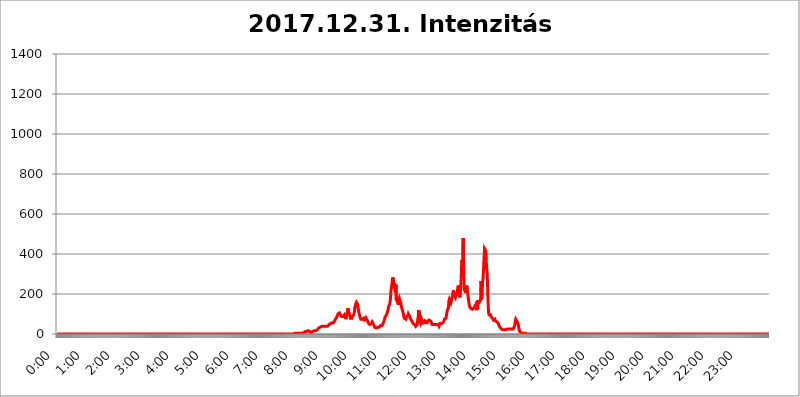
| Category | 2017.12.31. Intenzitás [W/m^2] |
|---|---|
| 0.0 | 0 |
| 0.0006944444444444445 | 0 |
| 0.001388888888888889 | 0 |
| 0.0020833333333333333 | 0 |
| 0.002777777777777778 | 0 |
| 0.003472222222222222 | 0 |
| 0.004166666666666667 | 0 |
| 0.004861111111111111 | 0 |
| 0.005555555555555556 | 0 |
| 0.0062499999999999995 | 0 |
| 0.006944444444444444 | 0 |
| 0.007638888888888889 | 0 |
| 0.008333333333333333 | 0 |
| 0.009027777777777779 | 0 |
| 0.009722222222222222 | 0 |
| 0.010416666666666666 | 0 |
| 0.011111111111111112 | 0 |
| 0.011805555555555555 | 0 |
| 0.012499999999999999 | 0 |
| 0.013194444444444444 | 0 |
| 0.013888888888888888 | 0 |
| 0.014583333333333332 | 0 |
| 0.015277777777777777 | 0 |
| 0.015972222222222224 | 0 |
| 0.016666666666666666 | 0 |
| 0.017361111111111112 | 0 |
| 0.018055555555555557 | 0 |
| 0.01875 | 0 |
| 0.019444444444444445 | 0 |
| 0.02013888888888889 | 0 |
| 0.020833333333333332 | 0 |
| 0.02152777777777778 | 0 |
| 0.022222222222222223 | 0 |
| 0.02291666666666667 | 0 |
| 0.02361111111111111 | 0 |
| 0.024305555555555556 | 0 |
| 0.024999999999999998 | 0 |
| 0.025694444444444447 | 0 |
| 0.02638888888888889 | 0 |
| 0.027083333333333334 | 0 |
| 0.027777777777777776 | 0 |
| 0.02847222222222222 | 0 |
| 0.029166666666666664 | 0 |
| 0.029861111111111113 | 0 |
| 0.030555555555555555 | 0 |
| 0.03125 | 0 |
| 0.03194444444444445 | 0 |
| 0.03263888888888889 | 0 |
| 0.03333333333333333 | 0 |
| 0.034027777777777775 | 0 |
| 0.034722222222222224 | 0 |
| 0.035416666666666666 | 0 |
| 0.036111111111111115 | 0 |
| 0.03680555555555556 | 0 |
| 0.0375 | 0 |
| 0.03819444444444444 | 0 |
| 0.03888888888888889 | 0 |
| 0.03958333333333333 | 0 |
| 0.04027777777777778 | 0 |
| 0.04097222222222222 | 0 |
| 0.041666666666666664 | 0 |
| 0.042361111111111106 | 0 |
| 0.04305555555555556 | 0 |
| 0.043750000000000004 | 0 |
| 0.044444444444444446 | 0 |
| 0.04513888888888889 | 0 |
| 0.04583333333333334 | 0 |
| 0.04652777777777778 | 0 |
| 0.04722222222222222 | 0 |
| 0.04791666666666666 | 0 |
| 0.04861111111111111 | 0 |
| 0.049305555555555554 | 0 |
| 0.049999999999999996 | 0 |
| 0.05069444444444445 | 0 |
| 0.051388888888888894 | 0 |
| 0.052083333333333336 | 0 |
| 0.05277777777777778 | 0 |
| 0.05347222222222222 | 0 |
| 0.05416666666666667 | 0 |
| 0.05486111111111111 | 0 |
| 0.05555555555555555 | 0 |
| 0.05625 | 0 |
| 0.05694444444444444 | 0 |
| 0.057638888888888885 | 0 |
| 0.05833333333333333 | 0 |
| 0.05902777777777778 | 0 |
| 0.059722222222222225 | 0 |
| 0.06041666666666667 | 0 |
| 0.061111111111111116 | 0 |
| 0.06180555555555556 | 0 |
| 0.0625 | 0 |
| 0.06319444444444444 | 0 |
| 0.06388888888888888 | 0 |
| 0.06458333333333334 | 0 |
| 0.06527777777777778 | 0 |
| 0.06597222222222222 | 0 |
| 0.06666666666666667 | 0 |
| 0.06736111111111111 | 0 |
| 0.06805555555555555 | 0 |
| 0.06874999999999999 | 0 |
| 0.06944444444444443 | 0 |
| 0.07013888888888889 | 0 |
| 0.07083333333333333 | 0 |
| 0.07152777777777779 | 0 |
| 0.07222222222222223 | 0 |
| 0.07291666666666667 | 0 |
| 0.07361111111111111 | 0 |
| 0.07430555555555556 | 0 |
| 0.075 | 0 |
| 0.07569444444444444 | 0 |
| 0.0763888888888889 | 0 |
| 0.07708333333333334 | 0 |
| 0.07777777777777778 | 0 |
| 0.07847222222222222 | 0 |
| 0.07916666666666666 | 0 |
| 0.0798611111111111 | 0 |
| 0.08055555555555556 | 0 |
| 0.08125 | 0 |
| 0.08194444444444444 | 0 |
| 0.08263888888888889 | 0 |
| 0.08333333333333333 | 0 |
| 0.08402777777777777 | 0 |
| 0.08472222222222221 | 0 |
| 0.08541666666666665 | 0 |
| 0.08611111111111112 | 0 |
| 0.08680555555555557 | 0 |
| 0.08750000000000001 | 0 |
| 0.08819444444444445 | 0 |
| 0.08888888888888889 | 0 |
| 0.08958333333333333 | 0 |
| 0.09027777777777778 | 0 |
| 0.09097222222222222 | 0 |
| 0.09166666666666667 | 0 |
| 0.09236111111111112 | 0 |
| 0.09305555555555556 | 0 |
| 0.09375 | 0 |
| 0.09444444444444444 | 0 |
| 0.09513888888888888 | 0 |
| 0.09583333333333333 | 0 |
| 0.09652777777777777 | 0 |
| 0.09722222222222222 | 0 |
| 0.09791666666666667 | 0 |
| 0.09861111111111111 | 0 |
| 0.09930555555555555 | 0 |
| 0.09999999999999999 | 0 |
| 0.10069444444444443 | 0 |
| 0.1013888888888889 | 0 |
| 0.10208333333333335 | 0 |
| 0.10277777777777779 | 0 |
| 0.10347222222222223 | 0 |
| 0.10416666666666667 | 0 |
| 0.10486111111111111 | 0 |
| 0.10555555555555556 | 0 |
| 0.10625 | 0 |
| 0.10694444444444444 | 0 |
| 0.1076388888888889 | 0 |
| 0.10833333333333334 | 0 |
| 0.10902777777777778 | 0 |
| 0.10972222222222222 | 0 |
| 0.1111111111111111 | 0 |
| 0.11180555555555556 | 0 |
| 0.11180555555555556 | 0 |
| 0.1125 | 0 |
| 0.11319444444444444 | 0 |
| 0.11388888888888889 | 0 |
| 0.11458333333333333 | 0 |
| 0.11527777777777777 | 0 |
| 0.11597222222222221 | 0 |
| 0.11666666666666665 | 0 |
| 0.1173611111111111 | 0 |
| 0.11805555555555557 | 0 |
| 0.11944444444444445 | 0 |
| 0.12013888888888889 | 0 |
| 0.12083333333333333 | 0 |
| 0.12152777777777778 | 0 |
| 0.12222222222222223 | 0 |
| 0.12291666666666667 | 0 |
| 0.12291666666666667 | 0 |
| 0.12361111111111112 | 0 |
| 0.12430555555555556 | 0 |
| 0.125 | 0 |
| 0.12569444444444444 | 0 |
| 0.12638888888888888 | 0 |
| 0.12708333333333333 | 0 |
| 0.16875 | 0 |
| 0.12847222222222224 | 0 |
| 0.12916666666666668 | 0 |
| 0.12986111111111112 | 0 |
| 0.13055555555555556 | 0 |
| 0.13125 | 0 |
| 0.13194444444444445 | 0 |
| 0.1326388888888889 | 0 |
| 0.13333333333333333 | 0 |
| 0.13402777777777777 | 0 |
| 0.13402777777777777 | 0 |
| 0.13472222222222222 | 0 |
| 0.13541666666666666 | 0 |
| 0.1361111111111111 | 0 |
| 0.13749999999999998 | 0 |
| 0.13819444444444443 | 0 |
| 0.1388888888888889 | 0 |
| 0.13958333333333334 | 0 |
| 0.14027777777777778 | 0 |
| 0.14097222222222222 | 0 |
| 0.14166666666666666 | 0 |
| 0.1423611111111111 | 0 |
| 0.14305555555555557 | 0 |
| 0.14375000000000002 | 0 |
| 0.14444444444444446 | 0 |
| 0.1451388888888889 | 0 |
| 0.1451388888888889 | 0 |
| 0.14652777777777778 | 0 |
| 0.14722222222222223 | 0 |
| 0.14791666666666667 | 0 |
| 0.1486111111111111 | 0 |
| 0.14930555555555555 | 0 |
| 0.15 | 0 |
| 0.15069444444444444 | 0 |
| 0.15138888888888888 | 0 |
| 0.15208333333333332 | 0 |
| 0.15277777777777776 | 0 |
| 0.15347222222222223 | 0 |
| 0.15416666666666667 | 0 |
| 0.15486111111111112 | 0 |
| 0.15555555555555556 | 0 |
| 0.15625 | 0 |
| 0.15694444444444444 | 0 |
| 0.15763888888888888 | 0 |
| 0.15833333333333333 | 0 |
| 0.15902777777777777 | 0 |
| 0.15972222222222224 | 0 |
| 0.16041666666666668 | 0 |
| 0.16111111111111112 | 0 |
| 0.16180555555555556 | 0 |
| 0.1625 | 0 |
| 0.16319444444444445 | 0 |
| 0.1638888888888889 | 0 |
| 0.16458333333333333 | 0 |
| 0.16527777777777777 | 0 |
| 0.16597222222222222 | 0 |
| 0.16666666666666666 | 0 |
| 0.1673611111111111 | 0 |
| 0.16805555555555554 | 0 |
| 0.16874999999999998 | 0 |
| 0.16944444444444443 | 0 |
| 0.17013888888888887 | 0 |
| 0.1708333333333333 | 0 |
| 0.17152777777777775 | 0 |
| 0.17222222222222225 | 0 |
| 0.1729166666666667 | 0 |
| 0.17361111111111113 | 0 |
| 0.17430555555555557 | 0 |
| 0.17500000000000002 | 0 |
| 0.17569444444444446 | 0 |
| 0.1763888888888889 | 0 |
| 0.17708333333333334 | 0 |
| 0.17777777777777778 | 0 |
| 0.17847222222222223 | 0 |
| 0.17916666666666667 | 0 |
| 0.1798611111111111 | 0 |
| 0.18055555555555555 | 0 |
| 0.18125 | 0 |
| 0.18194444444444444 | 0 |
| 0.1826388888888889 | 0 |
| 0.18333333333333335 | 0 |
| 0.1840277777777778 | 0 |
| 0.18472222222222223 | 0 |
| 0.18541666666666667 | 0 |
| 0.18611111111111112 | 0 |
| 0.18680555555555556 | 0 |
| 0.1875 | 0 |
| 0.18819444444444444 | 0 |
| 0.18888888888888888 | 0 |
| 0.18958333333333333 | 0 |
| 0.19027777777777777 | 0 |
| 0.1909722222222222 | 0 |
| 0.19166666666666665 | 0 |
| 0.19236111111111112 | 0 |
| 0.19305555555555554 | 0 |
| 0.19375 | 0 |
| 0.19444444444444445 | 0 |
| 0.1951388888888889 | 0 |
| 0.19583333333333333 | 0 |
| 0.19652777777777777 | 0 |
| 0.19722222222222222 | 0 |
| 0.19791666666666666 | 0 |
| 0.1986111111111111 | 0 |
| 0.19930555555555554 | 0 |
| 0.19999999999999998 | 0 |
| 0.20069444444444443 | 0 |
| 0.20138888888888887 | 0 |
| 0.2020833333333333 | 0 |
| 0.2027777777777778 | 0 |
| 0.2034722222222222 | 0 |
| 0.2041666666666667 | 0 |
| 0.20486111111111113 | 0 |
| 0.20555555555555557 | 0 |
| 0.20625000000000002 | 0 |
| 0.20694444444444446 | 0 |
| 0.2076388888888889 | 0 |
| 0.20833333333333334 | 0 |
| 0.20902777777777778 | 0 |
| 0.20972222222222223 | 0 |
| 0.21041666666666667 | 0 |
| 0.2111111111111111 | 0 |
| 0.21180555555555555 | 0 |
| 0.2125 | 0 |
| 0.21319444444444444 | 0 |
| 0.2138888888888889 | 0 |
| 0.21458333333333335 | 0 |
| 0.2152777777777778 | 0 |
| 0.21597222222222223 | 0 |
| 0.21666666666666667 | 0 |
| 0.21736111111111112 | 0 |
| 0.21805555555555556 | 0 |
| 0.21875 | 0 |
| 0.21944444444444444 | 0 |
| 0.22013888888888888 | 0 |
| 0.22083333333333333 | 0 |
| 0.22152777777777777 | 0 |
| 0.2222222222222222 | 0 |
| 0.22291666666666665 | 0 |
| 0.2236111111111111 | 0 |
| 0.22430555555555556 | 0 |
| 0.225 | 0 |
| 0.22569444444444445 | 0 |
| 0.2263888888888889 | 0 |
| 0.22708333333333333 | 0 |
| 0.22777777777777777 | 0 |
| 0.22847222222222222 | 0 |
| 0.22916666666666666 | 0 |
| 0.2298611111111111 | 0 |
| 0.23055555555555554 | 0 |
| 0.23124999999999998 | 0 |
| 0.23194444444444443 | 0 |
| 0.23263888888888887 | 0 |
| 0.2333333333333333 | 0 |
| 0.2340277777777778 | 0 |
| 0.2347222222222222 | 0 |
| 0.2354166666666667 | 0 |
| 0.23611111111111113 | 0 |
| 0.23680555555555557 | 0 |
| 0.23750000000000002 | 0 |
| 0.23819444444444446 | 0 |
| 0.2388888888888889 | 0 |
| 0.23958333333333334 | 0 |
| 0.24027777777777778 | 0 |
| 0.24097222222222223 | 0 |
| 0.24166666666666667 | 0 |
| 0.2423611111111111 | 0 |
| 0.24305555555555555 | 0 |
| 0.24375 | 0 |
| 0.24444444444444446 | 0 |
| 0.24513888888888888 | 0 |
| 0.24583333333333335 | 0 |
| 0.2465277777777778 | 0 |
| 0.24722222222222223 | 0 |
| 0.24791666666666667 | 0 |
| 0.24861111111111112 | 0 |
| 0.24930555555555556 | 0 |
| 0.25 | 0 |
| 0.25069444444444444 | 0 |
| 0.2513888888888889 | 0 |
| 0.2520833333333333 | 0 |
| 0.25277777777777777 | 0 |
| 0.2534722222222222 | 0 |
| 0.25416666666666665 | 0 |
| 0.2548611111111111 | 0 |
| 0.2555555555555556 | 0 |
| 0.25625000000000003 | 0 |
| 0.2569444444444445 | 0 |
| 0.2576388888888889 | 0 |
| 0.25833333333333336 | 0 |
| 0.2590277777777778 | 0 |
| 0.25972222222222224 | 0 |
| 0.2604166666666667 | 0 |
| 0.2611111111111111 | 0 |
| 0.26180555555555557 | 0 |
| 0.2625 | 0 |
| 0.26319444444444445 | 0 |
| 0.2638888888888889 | 0 |
| 0.26458333333333334 | 0 |
| 0.2652777777777778 | 0 |
| 0.2659722222222222 | 0 |
| 0.26666666666666666 | 0 |
| 0.2673611111111111 | 0 |
| 0.26805555555555555 | 0 |
| 0.26875 | 0 |
| 0.26944444444444443 | 0 |
| 0.2701388888888889 | 0 |
| 0.2708333333333333 | 0 |
| 0.27152777777777776 | 0 |
| 0.2722222222222222 | 0 |
| 0.27291666666666664 | 0 |
| 0.2736111111111111 | 0 |
| 0.2743055555555555 | 0 |
| 0.27499999999999997 | 0 |
| 0.27569444444444446 | 0 |
| 0.27638888888888885 | 0 |
| 0.27708333333333335 | 0 |
| 0.2777777777777778 | 0 |
| 0.27847222222222223 | 0 |
| 0.2791666666666667 | 0 |
| 0.2798611111111111 | 0 |
| 0.28055555555555556 | 0 |
| 0.28125 | 0 |
| 0.28194444444444444 | 0 |
| 0.2826388888888889 | 0 |
| 0.2833333333333333 | 0 |
| 0.28402777777777777 | 0 |
| 0.2847222222222222 | 0 |
| 0.28541666666666665 | 0 |
| 0.28611111111111115 | 0 |
| 0.28680555555555554 | 0 |
| 0.28750000000000003 | 0 |
| 0.2881944444444445 | 0 |
| 0.2888888888888889 | 0 |
| 0.28958333333333336 | 0 |
| 0.2902777777777778 | 0 |
| 0.29097222222222224 | 0 |
| 0.2916666666666667 | 0 |
| 0.2923611111111111 | 0 |
| 0.29305555555555557 | 0 |
| 0.29375 | 0 |
| 0.29444444444444445 | 0 |
| 0.2951388888888889 | 0 |
| 0.29583333333333334 | 0 |
| 0.2965277777777778 | 0 |
| 0.2972222222222222 | 0 |
| 0.29791666666666666 | 0 |
| 0.2986111111111111 | 0 |
| 0.29930555555555555 | 0 |
| 0.3 | 0 |
| 0.30069444444444443 | 0 |
| 0.3013888888888889 | 0 |
| 0.3020833333333333 | 0 |
| 0.30277777777777776 | 0 |
| 0.3034722222222222 | 0 |
| 0.30416666666666664 | 0 |
| 0.3048611111111111 | 0 |
| 0.3055555555555555 | 0 |
| 0.30624999999999997 | 0 |
| 0.3069444444444444 | 0 |
| 0.3076388888888889 | 0 |
| 0.30833333333333335 | 0 |
| 0.3090277777777778 | 0 |
| 0.30972222222222223 | 0 |
| 0.3104166666666667 | 0 |
| 0.3111111111111111 | 0 |
| 0.31180555555555556 | 0 |
| 0.3125 | 0 |
| 0.31319444444444444 | 0 |
| 0.3138888888888889 | 0 |
| 0.3145833333333333 | 0 |
| 0.31527777777777777 | 0 |
| 0.3159722222222222 | 0 |
| 0.31666666666666665 | 0 |
| 0.31736111111111115 | 0 |
| 0.31805555555555554 | 0 |
| 0.31875000000000003 | 0 |
| 0.3194444444444445 | 0 |
| 0.3201388888888889 | 0 |
| 0.32083333333333336 | 0 |
| 0.3215277777777778 | 0 |
| 0.32222222222222224 | 0 |
| 0.3229166666666667 | 0 |
| 0.3236111111111111 | 0 |
| 0.32430555555555557 | 0 |
| 0.325 | 0 |
| 0.32569444444444445 | 0 |
| 0.3263888888888889 | 0 |
| 0.32708333333333334 | 0 |
| 0.3277777777777778 | 0 |
| 0.3284722222222222 | 0 |
| 0.32916666666666666 | 0 |
| 0.3298611111111111 | 0 |
| 0.33055555555555555 | 0 |
| 0.33125 | 0 |
| 0.33194444444444443 | 3.525 |
| 0.3326388888888889 | 3.525 |
| 0.3333333333333333 | 3.525 |
| 0.3340277777777778 | 3.525 |
| 0.3347222222222222 | 3.525 |
| 0.3354166666666667 | 3.525 |
| 0.3361111111111111 | 7.887 |
| 0.3368055555555556 | 3.525 |
| 0.33749999999999997 | 3.525 |
| 0.33819444444444446 | 3.525 |
| 0.33888888888888885 | 3.525 |
| 0.33958333333333335 | 3.525 |
| 0.34027777777777773 | 3.525 |
| 0.34097222222222223 | 3.525 |
| 0.3416666666666666 | 3.525 |
| 0.3423611111111111 | 3.525 |
| 0.3430555555555555 | 3.525 |
| 0.34375 | 3.525 |
| 0.3444444444444445 | 3.525 |
| 0.3451388888888889 | 3.525 |
| 0.3458333333333334 | 7.887 |
| 0.34652777777777777 | 7.887 |
| 0.34722222222222227 | 7.887 |
| 0.34791666666666665 | 12.257 |
| 0.34861111111111115 | 12.257 |
| 0.34930555555555554 | 12.257 |
| 0.35000000000000003 | 12.257 |
| 0.3506944444444444 | 12.257 |
| 0.3513888888888889 | 12.257 |
| 0.3520833333333333 | 16.636 |
| 0.3527777777777778 | 16.636 |
| 0.3534722222222222 | 16.636 |
| 0.3541666666666667 | 12.257 |
| 0.3548611111111111 | 12.257 |
| 0.35555555555555557 | 7.887 |
| 0.35625 | 7.887 |
| 0.35694444444444445 | 7.887 |
| 0.3576388888888889 | 7.887 |
| 0.35833333333333334 | 12.257 |
| 0.3590277777777778 | 12.257 |
| 0.3597222222222222 | 12.257 |
| 0.36041666666666666 | 16.636 |
| 0.3611111111111111 | 16.636 |
| 0.36180555555555555 | 21.024 |
| 0.3625 | 16.636 |
| 0.36319444444444443 | 21.024 |
| 0.3638888888888889 | 21.024 |
| 0.3645833333333333 | 21.024 |
| 0.3652777777777778 | 25.419 |
| 0.3659722222222222 | 25.419 |
| 0.3666666666666667 | 29.823 |
| 0.3673611111111111 | 29.823 |
| 0.3680555555555556 | 34.234 |
| 0.36874999999999997 | 34.234 |
| 0.36944444444444446 | 38.653 |
| 0.37013888888888885 | 38.653 |
| 0.37083333333333335 | 38.653 |
| 0.37152777777777773 | 38.653 |
| 0.37222222222222223 | 38.653 |
| 0.3729166666666666 | 38.653 |
| 0.3736111111111111 | 38.653 |
| 0.3743055555555555 | 38.653 |
| 0.375 | 38.653 |
| 0.3756944444444445 | 38.653 |
| 0.3763888888888889 | 43.079 |
| 0.3770833333333334 | 38.653 |
| 0.37777777777777777 | 38.653 |
| 0.37847222222222227 | 38.653 |
| 0.37916666666666665 | 38.653 |
| 0.37986111111111115 | 38.653 |
| 0.38055555555555554 | 43.079 |
| 0.38125000000000003 | 47.511 |
| 0.3819444444444444 | 47.511 |
| 0.3826388888888889 | 51.951 |
| 0.3833333333333333 | 51.951 |
| 0.3840277777777778 | 56.398 |
| 0.3847222222222222 | 56.398 |
| 0.3854166666666667 | 56.398 |
| 0.3861111111111111 | 56.398 |
| 0.38680555555555557 | 56.398 |
| 0.3875 | 56.398 |
| 0.38819444444444445 | 60.85 |
| 0.3888888888888889 | 65.31 |
| 0.38958333333333334 | 69.775 |
| 0.3902777777777778 | 74.246 |
| 0.3909722222222222 | 74.246 |
| 0.39166666666666666 | 78.722 |
| 0.3923611111111111 | 87.692 |
| 0.39305555555555555 | 92.184 |
| 0.39375 | 101.184 |
| 0.39444444444444443 | 105.69 |
| 0.3951388888888889 | 101.184 |
| 0.3958333333333333 | 105.69 |
| 0.3965277777777778 | 101.184 |
| 0.3972222222222222 | 96.682 |
| 0.3979166666666667 | 92.184 |
| 0.3986111111111111 | 87.692 |
| 0.3993055555555556 | 87.692 |
| 0.39999999999999997 | 83.205 |
| 0.40069444444444446 | 87.692 |
| 0.40138888888888885 | 92.184 |
| 0.40208333333333335 | 87.692 |
| 0.40277777777777773 | 96.682 |
| 0.40347222222222223 | 92.184 |
| 0.4041666666666666 | 87.692 |
| 0.4048611111111111 | 74.246 |
| 0.4055555555555555 | 78.722 |
| 0.40625 | 101.184 |
| 0.4069444444444445 | 110.201 |
| 0.4076388888888889 | 128.284 |
| 0.4083333333333334 | 114.716 |
| 0.40902777777777777 | 110.201 |
| 0.40972222222222227 | 101.184 |
| 0.41041666666666665 | 92.184 |
| 0.41111111111111115 | 78.722 |
| 0.41180555555555554 | 74.246 |
| 0.41250000000000003 | 74.246 |
| 0.4131944444444444 | 78.722 |
| 0.4138888888888889 | 87.692 |
| 0.4145833333333333 | 92.184 |
| 0.4152777777777778 | 87.692 |
| 0.4159722222222222 | 96.682 |
| 0.4166666666666667 | 110.201 |
| 0.4173611111111111 | 132.814 |
| 0.41805555555555557 | 141.884 |
| 0.41875 | 132.814 |
| 0.41944444444444445 | 128.284 |
| 0.4201388888888889 | 155.509 |
| 0.42083333333333334 | 160.056 |
| 0.4215277777777778 | 146.423 |
| 0.4222222222222222 | 123.758 |
| 0.42291666666666666 | 110.201 |
| 0.4236111111111111 | 101.184 |
| 0.42430555555555555 | 87.692 |
| 0.425 | 83.205 |
| 0.42569444444444443 | 74.246 |
| 0.4263888888888889 | 78.722 |
| 0.4270833333333333 | 74.246 |
| 0.4277777777777778 | 74.246 |
| 0.4284722222222222 | 78.722 |
| 0.4291666666666667 | 78.722 |
| 0.4298611111111111 | 78.722 |
| 0.4305555555555556 | 69.775 |
| 0.43124999999999997 | 65.31 |
| 0.43194444444444446 | 65.31 |
| 0.43263888888888885 | 69.775 |
| 0.43333333333333335 | 78.722 |
| 0.43402777777777773 | 83.205 |
| 0.43472222222222223 | 78.722 |
| 0.4354166666666666 | 65.31 |
| 0.4361111111111111 | 56.398 |
| 0.4368055555555555 | 51.951 |
| 0.4375 | 51.951 |
| 0.4381944444444445 | 47.511 |
| 0.4388888888888889 | 47.511 |
| 0.4395833333333334 | 51.951 |
| 0.44027777777777777 | 51.951 |
| 0.44097222222222227 | 56.398 |
| 0.44166666666666665 | 60.85 |
| 0.44236111111111115 | 60.85 |
| 0.44305555555555554 | 56.398 |
| 0.44375000000000003 | 47.511 |
| 0.4444444444444444 | 43.079 |
| 0.4451388888888889 | 34.234 |
| 0.4458333333333333 | 34.234 |
| 0.4465277777777778 | 34.234 |
| 0.4472222222222222 | 29.823 |
| 0.4479166666666667 | 29.823 |
| 0.4486111111111111 | 34.234 |
| 0.44930555555555557 | 34.234 |
| 0.45 | 34.234 |
| 0.45069444444444445 | 34.234 |
| 0.4513888888888889 | 34.234 |
| 0.45208333333333334 | 38.653 |
| 0.4527777777777778 | 38.653 |
| 0.4534722222222222 | 43.079 |
| 0.45416666666666666 | 43.079 |
| 0.4548611111111111 | 43.079 |
| 0.45555555555555555 | 43.079 |
| 0.45625 | 47.511 |
| 0.45694444444444443 | 51.951 |
| 0.4576388888888889 | 56.398 |
| 0.4583333333333333 | 65.31 |
| 0.4590277777777778 | 74.246 |
| 0.4597222222222222 | 83.205 |
| 0.4604166666666667 | 83.205 |
| 0.4611111111111111 | 87.692 |
| 0.4618055555555556 | 96.682 |
| 0.46249999999999997 | 101.184 |
| 0.46319444444444446 | 110.201 |
| 0.46388888888888885 | 119.235 |
| 0.46458333333333335 | 137.347 |
| 0.46527777777777773 | 141.884 |
| 0.46597222222222223 | 146.423 |
| 0.4666666666666666 | 155.509 |
| 0.4673611111111111 | 178.264 |
| 0.4680555555555555 | 219.309 |
| 0.46875 | 228.436 |
| 0.4694444444444445 | 251.251 |
| 0.4701388888888889 | 274.047 |
| 0.4708333333333334 | 283.156 |
| 0.47152777777777777 | 264.932 |
| 0.47222222222222227 | 242.127 |
| 0.47291666666666665 | 255.813 |
| 0.47361111111111115 | 223.873 |
| 0.47430555555555554 | 205.62 |
| 0.47500000000000003 | 246.689 |
| 0.4756944444444444 | 164.605 |
| 0.4763888888888889 | 182.82 |
| 0.4770833333333333 | 160.056 |
| 0.4777777777777778 | 164.605 |
| 0.4784722222222222 | 146.423 |
| 0.4791666666666667 | 169.156 |
| 0.4798611111111111 | 178.264 |
| 0.48055555555555557 | 169.156 |
| 0.48125 | 173.709 |
| 0.48194444444444445 | 155.509 |
| 0.4826388888888889 | 137.347 |
| 0.48333333333333334 | 128.284 |
| 0.4840277777777778 | 119.235 |
| 0.4847222222222222 | 110.201 |
| 0.48541666666666666 | 101.184 |
| 0.4861111111111111 | 87.692 |
| 0.48680555555555555 | 78.722 |
| 0.4875 | 74.246 |
| 0.48819444444444443 | 74.246 |
| 0.4888888888888889 | 74.246 |
| 0.4895833333333333 | 83.205 |
| 0.4902777777777778 | 87.692 |
| 0.4909722222222222 | 87.692 |
| 0.4916666666666667 | 92.184 |
| 0.4923611111111111 | 101.184 |
| 0.4930555555555556 | 96.682 |
| 0.49374999999999997 | 101.184 |
| 0.49444444444444446 | 87.692 |
| 0.49513888888888885 | 78.722 |
| 0.49583333333333335 | 78.722 |
| 0.49652777777777773 | 69.775 |
| 0.49722222222222223 | 65.31 |
| 0.4979166666666666 | 60.85 |
| 0.4986111111111111 | 56.398 |
| 0.4993055555555555 | 51.951 |
| 0.5 | 47.511 |
| 0.5006944444444444 | 47.511 |
| 0.5013888888888889 | 47.511 |
| 0.5020833333333333 | 43.079 |
| 0.5027777777777778 | 38.653 |
| 0.5034722222222222 | 34.234 |
| 0.5041666666666667 | 38.653 |
| 0.5048611111111111 | 47.511 |
| 0.5055555555555555 | 69.775 |
| 0.50625 | 87.692 |
| 0.5069444444444444 | 119.235 |
| 0.5076388888888889 | 114.716 |
| 0.5083333333333333 | 92.184 |
| 0.5090277777777777 | 65.31 |
| 0.5097222222222222 | 56.398 |
| 0.5104166666666666 | 65.31 |
| 0.5111111111111112 | 74.246 |
| 0.5118055555555555 | 69.775 |
| 0.5125000000000001 | 74.246 |
| 0.5131944444444444 | 56.398 |
| 0.513888888888889 | 56.398 |
| 0.5145833333333333 | 60.85 |
| 0.5152777777777778 | 65.31 |
| 0.5159722222222222 | 65.31 |
| 0.5166666666666667 | 56.398 |
| 0.517361111111111 | 56.398 |
| 0.5180555555555556 | 56.398 |
| 0.5187499999999999 | 56.398 |
| 0.5194444444444445 | 65.31 |
| 0.5201388888888888 | 65.31 |
| 0.5208333333333334 | 69.775 |
| 0.5215277777777778 | 69.775 |
| 0.5222222222222223 | 74.246 |
| 0.5229166666666667 | 69.775 |
| 0.5236111111111111 | 65.31 |
| 0.5243055555555556 | 60.85 |
| 0.525 | 56.398 |
| 0.5256944444444445 | 47.511 |
| 0.5263888888888889 | 47.511 |
| 0.5270833333333333 | 43.079 |
| 0.5277777777777778 | 47.511 |
| 0.5284722222222222 | 47.511 |
| 0.5291666666666667 | 47.511 |
| 0.5298611111111111 | 47.511 |
| 0.5305555555555556 | 47.511 |
| 0.53125 | 43.079 |
| 0.5319444444444444 | 47.511 |
| 0.5326388888888889 | 47.511 |
| 0.5333333333333333 | 47.511 |
| 0.5340277777777778 | 47.511 |
| 0.5347222222222222 | 47.511 |
| 0.5354166666666667 | 38.653 |
| 0.5361111111111111 | 43.079 |
| 0.5368055555555555 | 51.951 |
| 0.5375 | 51.951 |
| 0.5381944444444444 | 56.398 |
| 0.5388888888888889 | 51.951 |
| 0.5395833333333333 | 56.398 |
| 0.5402777777777777 | 51.951 |
| 0.5409722222222222 | 56.398 |
| 0.5416666666666666 | 56.398 |
| 0.5423611111111112 | 65.31 |
| 0.5430555555555555 | 74.246 |
| 0.5437500000000001 | 74.246 |
| 0.5444444444444444 | 69.775 |
| 0.545138888888889 | 78.722 |
| 0.5458333333333333 | 92.184 |
| 0.5465277777777778 | 110.201 |
| 0.5472222222222222 | 119.235 |
| 0.5479166666666667 | 119.235 |
| 0.548611111111111 | 132.814 |
| 0.5493055555555556 | 164.605 |
| 0.5499999999999999 | 173.709 |
| 0.5506944444444445 | 178.264 |
| 0.5513888888888888 | 173.709 |
| 0.5520833333333334 | 155.509 |
| 0.5527777777777778 | 164.605 |
| 0.5534722222222223 | 173.709 |
| 0.5541666666666667 | 169.156 |
| 0.5548611111111111 | 173.709 |
| 0.5555555555555556 | 219.309 |
| 0.55625 | 201.058 |
| 0.5569444444444445 | 191.937 |
| 0.5576388888888889 | 187.378 |
| 0.5583333333333333 | 182.82 |
| 0.5590277777777778 | 196.497 |
| 0.5597222222222222 | 210.182 |
| 0.5604166666666667 | 191.937 |
| 0.5611111111111111 | 210.182 |
| 0.5618055555555556 | 233 |
| 0.5625 | 242.127 |
| 0.5631944444444444 | 228.436 |
| 0.5638888888888889 | 210.182 |
| 0.5645833333333333 | 182.82 |
| 0.5652777777777778 | 178.264 |
| 0.5659722222222222 | 242.127 |
| 0.5666666666666667 | 283.156 |
| 0.5673611111111111 | 369.23 |
| 0.5680555555555555 | 364.728 |
| 0.56875 | 342.162 |
| 0.5694444444444444 | 480.356 |
| 0.5701388888888889 | 296.808 |
| 0.5708333333333333 | 223.873 |
| 0.5715277777777777 | 214.746 |
| 0.5722222222222222 | 228.436 |
| 0.5729166666666666 | 205.62 |
| 0.5736111111111112 | 223.873 |
| 0.5743055555555555 | 242.127 |
| 0.5750000000000001 | 223.873 |
| 0.5756944444444444 | 228.436 |
| 0.576388888888889 | 182.82 |
| 0.5770833333333333 | 164.605 |
| 0.5777777777777778 | 146.423 |
| 0.5784722222222222 | 137.347 |
| 0.5791666666666667 | 132.814 |
| 0.579861111111111 | 128.284 |
| 0.5805555555555556 | 128.284 |
| 0.5812499999999999 | 128.284 |
| 0.5819444444444445 | 123.758 |
| 0.5826388888888888 | 123.758 |
| 0.5833333333333334 | 123.758 |
| 0.5840277777777778 | 128.284 |
| 0.5847222222222223 | 132.814 |
| 0.5854166666666667 | 137.347 |
| 0.5861111111111111 | 128.284 |
| 0.5868055555555556 | 146.423 |
| 0.5875 | 132.814 |
| 0.5881944444444445 | 119.235 |
| 0.5888888888888889 | 164.605 |
| 0.5895833333333333 | 123.758 |
| 0.5902777777777778 | 169.156 |
| 0.5909722222222222 | 155.509 |
| 0.5916666666666667 | 155.509 |
| 0.5923611111111111 | 150.964 |
| 0.5930555555555556 | 164.605 |
| 0.59375 | 173.709 |
| 0.5944444444444444 | 264.932 |
| 0.5951388888888889 | 173.709 |
| 0.5958333333333333 | 187.378 |
| 0.5965277777777778 | 260.373 |
| 0.5972222222222222 | 274.047 |
| 0.5979166666666667 | 324.052 |
| 0.5986111111111111 | 382.715 |
| 0.5993055555555555 | 427.39 |
| 0.6 | 422.943 |
| 0.6006944444444444 | 427.39 |
| 0.6013888888888889 | 414.035 |
| 0.6020833333333333 | 328.584 |
| 0.6027777777777777 | 319.517 |
| 0.6034722222222222 | 255.813 |
| 0.6041666666666666 | 164.605 |
| 0.6048611111111112 | 110.201 |
| 0.6055555555555555 | 96.682 |
| 0.6062500000000001 | 96.682 |
| 0.6069444444444444 | 101.184 |
| 0.607638888888889 | 96.682 |
| 0.6083333333333333 | 87.692 |
| 0.6090277777777778 | 83.205 |
| 0.6097222222222222 | 83.205 |
| 0.6104166666666667 | 78.722 |
| 0.611111111111111 | 74.246 |
| 0.6118055555555556 | 69.775 |
| 0.6124999999999999 | 65.31 |
| 0.6131944444444445 | 69.775 |
| 0.6138888888888888 | 74.246 |
| 0.6145833333333334 | 65.31 |
| 0.6152777777777778 | 60.85 |
| 0.6159722222222223 | 60.85 |
| 0.6166666666666667 | 60.85 |
| 0.6173611111111111 | 56.398 |
| 0.6180555555555556 | 56.398 |
| 0.61875 | 51.951 |
| 0.6194444444444445 | 43.079 |
| 0.6201388888888889 | 38.653 |
| 0.6208333333333333 | 34.234 |
| 0.6215277777777778 | 29.823 |
| 0.6222222222222222 | 29.823 |
| 0.6229166666666667 | 25.419 |
| 0.6236111111111111 | 25.419 |
| 0.6243055555555556 | 21.024 |
| 0.625 | 21.024 |
| 0.6256944444444444 | 21.024 |
| 0.6263888888888889 | 21.024 |
| 0.6270833333333333 | 21.024 |
| 0.6277777777777778 | 21.024 |
| 0.6284722222222222 | 21.024 |
| 0.6291666666666667 | 21.024 |
| 0.6298611111111111 | 21.024 |
| 0.6305555555555555 | 25.419 |
| 0.63125 | 25.419 |
| 0.6319444444444444 | 25.419 |
| 0.6326388888888889 | 25.419 |
| 0.6333333333333333 | 25.419 |
| 0.6340277777777777 | 25.419 |
| 0.6347222222222222 | 29.823 |
| 0.6354166666666666 | 25.419 |
| 0.6361111111111112 | 25.419 |
| 0.6368055555555555 | 25.419 |
| 0.6375000000000001 | 25.419 |
| 0.6381944444444444 | 25.419 |
| 0.638888888888889 | 25.419 |
| 0.6395833333333333 | 25.419 |
| 0.6402777777777778 | 29.823 |
| 0.6409722222222222 | 29.823 |
| 0.6416666666666667 | 43.079 |
| 0.642361111111111 | 65.31 |
| 0.6430555555555556 | 74.246 |
| 0.6437499999999999 | 69.775 |
| 0.6444444444444445 | 65.31 |
| 0.6451388888888888 | 60.85 |
| 0.6458333333333334 | 56.398 |
| 0.6465277777777778 | 47.511 |
| 0.6472222222222223 | 34.234 |
| 0.6479166666666667 | 21.024 |
| 0.6486111111111111 | 12.257 |
| 0.6493055555555556 | 12.257 |
| 0.65 | 12.257 |
| 0.6506944444444445 | 7.887 |
| 0.6513888888888889 | 7.887 |
| 0.6520833333333333 | 7.887 |
| 0.6527777777777778 | 3.525 |
| 0.6534722222222222 | 3.525 |
| 0.6541666666666667 | 3.525 |
| 0.6548611111111111 | 3.525 |
| 0.6555555555555556 | 3.525 |
| 0.65625 | 3.525 |
| 0.6569444444444444 | 3.525 |
| 0.6576388888888889 | 3.525 |
| 0.6583333333333333 | 0 |
| 0.6590277777777778 | 0 |
| 0.6597222222222222 | 0 |
| 0.6604166666666667 | 0 |
| 0.6611111111111111 | 0 |
| 0.6618055555555555 | 0 |
| 0.6625 | 0 |
| 0.6631944444444444 | 0 |
| 0.6638888888888889 | 0 |
| 0.6645833333333333 | 0 |
| 0.6652777777777777 | 0 |
| 0.6659722222222222 | 0 |
| 0.6666666666666666 | 0 |
| 0.6673611111111111 | 0 |
| 0.6680555555555556 | 0 |
| 0.6687500000000001 | 0 |
| 0.6694444444444444 | 0 |
| 0.6701388888888888 | 0 |
| 0.6708333333333334 | 0 |
| 0.6715277777777778 | 0 |
| 0.6722222222222222 | 0 |
| 0.6729166666666666 | 0 |
| 0.6736111111111112 | 0 |
| 0.6743055555555556 | 0 |
| 0.6749999999999999 | 0 |
| 0.6756944444444444 | 0 |
| 0.6763888888888889 | 0 |
| 0.6770833333333334 | 0 |
| 0.6777777777777777 | 0 |
| 0.6784722222222223 | 0 |
| 0.6791666666666667 | 0 |
| 0.6798611111111111 | 0 |
| 0.6805555555555555 | 0 |
| 0.68125 | 0 |
| 0.6819444444444445 | 0 |
| 0.6826388888888889 | 0 |
| 0.6833333333333332 | 0 |
| 0.6840277777777778 | 0 |
| 0.6847222222222222 | 0 |
| 0.6854166666666667 | 0 |
| 0.686111111111111 | 0 |
| 0.6868055555555556 | 0 |
| 0.6875 | 0 |
| 0.6881944444444444 | 0 |
| 0.688888888888889 | 0 |
| 0.6895833333333333 | 0 |
| 0.6902777777777778 | 0 |
| 0.6909722222222222 | 0 |
| 0.6916666666666668 | 0 |
| 0.6923611111111111 | 0 |
| 0.6930555555555555 | 0 |
| 0.69375 | 0 |
| 0.6944444444444445 | 0 |
| 0.6951388888888889 | 0 |
| 0.6958333333333333 | 0 |
| 0.6965277777777777 | 0 |
| 0.6972222222222223 | 0 |
| 0.6979166666666666 | 0 |
| 0.6986111111111111 | 0 |
| 0.6993055555555556 | 0 |
| 0.7000000000000001 | 0 |
| 0.7006944444444444 | 0 |
| 0.7013888888888888 | 0 |
| 0.7020833333333334 | 0 |
| 0.7027777777777778 | 0 |
| 0.7034722222222222 | 0 |
| 0.7041666666666666 | 0 |
| 0.7048611111111112 | 0 |
| 0.7055555555555556 | 0 |
| 0.7062499999999999 | 0 |
| 0.7069444444444444 | 0 |
| 0.7076388888888889 | 0 |
| 0.7083333333333334 | 0 |
| 0.7090277777777777 | 0 |
| 0.7097222222222223 | 0 |
| 0.7104166666666667 | 0 |
| 0.7111111111111111 | 0 |
| 0.7118055555555555 | 0 |
| 0.7125 | 0 |
| 0.7131944444444445 | 0 |
| 0.7138888888888889 | 0 |
| 0.7145833333333332 | 0 |
| 0.7152777777777778 | 0 |
| 0.7159722222222222 | 0 |
| 0.7166666666666667 | 0 |
| 0.717361111111111 | 0 |
| 0.7180555555555556 | 0 |
| 0.71875 | 0 |
| 0.7194444444444444 | 0 |
| 0.720138888888889 | 0 |
| 0.7208333333333333 | 0 |
| 0.7215277777777778 | 0 |
| 0.7222222222222222 | 0 |
| 0.7229166666666668 | 0 |
| 0.7236111111111111 | 0 |
| 0.7243055555555555 | 0 |
| 0.725 | 0 |
| 0.7256944444444445 | 0 |
| 0.7263888888888889 | 0 |
| 0.7270833333333333 | 0 |
| 0.7277777777777777 | 0 |
| 0.7284722222222223 | 0 |
| 0.7291666666666666 | 0 |
| 0.7298611111111111 | 0 |
| 0.7305555555555556 | 0 |
| 0.7312500000000001 | 0 |
| 0.7319444444444444 | 0 |
| 0.7326388888888888 | 0 |
| 0.7333333333333334 | 0 |
| 0.7340277777777778 | 0 |
| 0.7347222222222222 | 0 |
| 0.7354166666666666 | 0 |
| 0.7361111111111112 | 0 |
| 0.7368055555555556 | 0 |
| 0.7374999999999999 | 0 |
| 0.7381944444444444 | 0 |
| 0.7388888888888889 | 0 |
| 0.7395833333333334 | 0 |
| 0.7402777777777777 | 0 |
| 0.7409722222222223 | 0 |
| 0.7416666666666667 | 0 |
| 0.7423611111111111 | 0 |
| 0.7430555555555555 | 0 |
| 0.74375 | 0 |
| 0.7444444444444445 | 0 |
| 0.7451388888888889 | 0 |
| 0.7458333333333332 | 0 |
| 0.7465277777777778 | 0 |
| 0.7472222222222222 | 0 |
| 0.7479166666666667 | 0 |
| 0.748611111111111 | 0 |
| 0.7493055555555556 | 0 |
| 0.75 | 0 |
| 0.7506944444444444 | 0 |
| 0.751388888888889 | 0 |
| 0.7520833333333333 | 0 |
| 0.7527777777777778 | 0 |
| 0.7534722222222222 | 0 |
| 0.7541666666666668 | 0 |
| 0.7548611111111111 | 0 |
| 0.7555555555555555 | 0 |
| 0.75625 | 0 |
| 0.7569444444444445 | 0 |
| 0.7576388888888889 | 0 |
| 0.7583333333333333 | 0 |
| 0.7590277777777777 | 0 |
| 0.7597222222222223 | 0 |
| 0.7604166666666666 | 0 |
| 0.7611111111111111 | 0 |
| 0.7618055555555556 | 0 |
| 0.7625000000000001 | 0 |
| 0.7631944444444444 | 0 |
| 0.7638888888888888 | 0 |
| 0.7645833333333334 | 0 |
| 0.7652777777777778 | 0 |
| 0.7659722222222222 | 0 |
| 0.7666666666666666 | 0 |
| 0.7673611111111112 | 0 |
| 0.7680555555555556 | 0 |
| 0.7687499999999999 | 0 |
| 0.7694444444444444 | 0 |
| 0.7701388888888889 | 0 |
| 0.7708333333333334 | 0 |
| 0.7715277777777777 | 0 |
| 0.7722222222222223 | 0 |
| 0.7729166666666667 | 0 |
| 0.7736111111111111 | 0 |
| 0.7743055555555555 | 0 |
| 0.775 | 0 |
| 0.7756944444444445 | 0 |
| 0.7763888888888889 | 0 |
| 0.7770833333333332 | 0 |
| 0.7777777777777778 | 0 |
| 0.7784722222222222 | 0 |
| 0.7791666666666667 | 0 |
| 0.779861111111111 | 0 |
| 0.7805555555555556 | 0 |
| 0.78125 | 0 |
| 0.7819444444444444 | 0 |
| 0.782638888888889 | 0 |
| 0.7833333333333333 | 0 |
| 0.7840277777777778 | 0 |
| 0.7847222222222222 | 0 |
| 0.7854166666666668 | 0 |
| 0.7861111111111111 | 0 |
| 0.7868055555555555 | 0 |
| 0.7875 | 0 |
| 0.7881944444444445 | 0 |
| 0.7888888888888889 | 0 |
| 0.7895833333333333 | 0 |
| 0.7902777777777777 | 0 |
| 0.7909722222222223 | 0 |
| 0.7916666666666666 | 0 |
| 0.7923611111111111 | 0 |
| 0.7930555555555556 | 0 |
| 0.7937500000000001 | 0 |
| 0.7944444444444444 | 0 |
| 0.7951388888888888 | 0 |
| 0.7958333333333334 | 0 |
| 0.7965277777777778 | 0 |
| 0.7972222222222222 | 0 |
| 0.7979166666666666 | 0 |
| 0.7986111111111112 | 0 |
| 0.7993055555555556 | 0 |
| 0.7999999999999999 | 0 |
| 0.8006944444444444 | 0 |
| 0.8013888888888889 | 0 |
| 0.8020833333333334 | 0 |
| 0.8027777777777777 | 0 |
| 0.8034722222222223 | 0 |
| 0.8041666666666667 | 0 |
| 0.8048611111111111 | 0 |
| 0.8055555555555555 | 0 |
| 0.80625 | 0 |
| 0.8069444444444445 | 0 |
| 0.8076388888888889 | 0 |
| 0.8083333333333332 | 0 |
| 0.8090277777777778 | 0 |
| 0.8097222222222222 | 0 |
| 0.8104166666666667 | 0 |
| 0.811111111111111 | 0 |
| 0.8118055555555556 | 0 |
| 0.8125 | 0 |
| 0.8131944444444444 | 0 |
| 0.813888888888889 | 0 |
| 0.8145833333333333 | 0 |
| 0.8152777777777778 | 0 |
| 0.8159722222222222 | 0 |
| 0.8166666666666668 | 0 |
| 0.8173611111111111 | 0 |
| 0.8180555555555555 | 0 |
| 0.81875 | 0 |
| 0.8194444444444445 | 0 |
| 0.8201388888888889 | 0 |
| 0.8208333333333333 | 0 |
| 0.8215277777777777 | 0 |
| 0.8222222222222223 | 0 |
| 0.8229166666666666 | 0 |
| 0.8236111111111111 | 0 |
| 0.8243055555555556 | 0 |
| 0.8250000000000001 | 0 |
| 0.8256944444444444 | 0 |
| 0.8263888888888888 | 0 |
| 0.8270833333333334 | 0 |
| 0.8277777777777778 | 0 |
| 0.8284722222222222 | 0 |
| 0.8291666666666666 | 0 |
| 0.8298611111111112 | 0 |
| 0.8305555555555556 | 0 |
| 0.8312499999999999 | 0 |
| 0.8319444444444444 | 0 |
| 0.8326388888888889 | 0 |
| 0.8333333333333334 | 0 |
| 0.8340277777777777 | 0 |
| 0.8347222222222223 | 0 |
| 0.8354166666666667 | 0 |
| 0.8361111111111111 | 0 |
| 0.8368055555555555 | 0 |
| 0.8375 | 0 |
| 0.8381944444444445 | 0 |
| 0.8388888888888889 | 0 |
| 0.8395833333333332 | 0 |
| 0.8402777777777778 | 0 |
| 0.8409722222222222 | 0 |
| 0.8416666666666667 | 0 |
| 0.842361111111111 | 0 |
| 0.8430555555555556 | 0 |
| 0.84375 | 0 |
| 0.8444444444444444 | 0 |
| 0.845138888888889 | 0 |
| 0.8458333333333333 | 0 |
| 0.8465277777777778 | 0 |
| 0.8472222222222222 | 0 |
| 0.8479166666666668 | 0 |
| 0.8486111111111111 | 0 |
| 0.8493055555555555 | 0 |
| 0.85 | 0 |
| 0.8506944444444445 | 0 |
| 0.8513888888888889 | 0 |
| 0.8520833333333333 | 0 |
| 0.8527777777777777 | 0 |
| 0.8534722222222223 | 0 |
| 0.8541666666666666 | 0 |
| 0.8548611111111111 | 0 |
| 0.8555555555555556 | 0 |
| 0.8562500000000001 | 0 |
| 0.8569444444444444 | 0 |
| 0.8576388888888888 | 0 |
| 0.8583333333333334 | 0 |
| 0.8590277777777778 | 0 |
| 0.8597222222222222 | 0 |
| 0.8604166666666666 | 0 |
| 0.8611111111111112 | 0 |
| 0.8618055555555556 | 0 |
| 0.8624999999999999 | 0 |
| 0.8631944444444444 | 0 |
| 0.8638888888888889 | 0 |
| 0.8645833333333334 | 0 |
| 0.8652777777777777 | 0 |
| 0.8659722222222223 | 0 |
| 0.8666666666666667 | 0 |
| 0.8673611111111111 | 0 |
| 0.8680555555555555 | 0 |
| 0.86875 | 0 |
| 0.8694444444444445 | 0 |
| 0.8701388888888889 | 0 |
| 0.8708333333333332 | 0 |
| 0.8715277777777778 | 0 |
| 0.8722222222222222 | 0 |
| 0.8729166666666667 | 0 |
| 0.873611111111111 | 0 |
| 0.8743055555555556 | 0 |
| 0.875 | 0 |
| 0.8756944444444444 | 0 |
| 0.876388888888889 | 0 |
| 0.8770833333333333 | 0 |
| 0.8777777777777778 | 0 |
| 0.8784722222222222 | 0 |
| 0.8791666666666668 | 0 |
| 0.8798611111111111 | 0 |
| 0.8805555555555555 | 0 |
| 0.88125 | 0 |
| 0.8819444444444445 | 0 |
| 0.8826388888888889 | 0 |
| 0.8833333333333333 | 0 |
| 0.8840277777777777 | 0 |
| 0.8847222222222223 | 0 |
| 0.8854166666666666 | 0 |
| 0.8861111111111111 | 0 |
| 0.8868055555555556 | 0 |
| 0.8875000000000001 | 0 |
| 0.8881944444444444 | 0 |
| 0.8888888888888888 | 0 |
| 0.8895833333333334 | 0 |
| 0.8902777777777778 | 0 |
| 0.8909722222222222 | 0 |
| 0.8916666666666666 | 0 |
| 0.8923611111111112 | 0 |
| 0.8930555555555556 | 0 |
| 0.8937499999999999 | 0 |
| 0.8944444444444444 | 0 |
| 0.8951388888888889 | 0 |
| 0.8958333333333334 | 0 |
| 0.8965277777777777 | 0 |
| 0.8972222222222223 | 0 |
| 0.8979166666666667 | 0 |
| 0.8986111111111111 | 0 |
| 0.8993055555555555 | 0 |
| 0.9 | 0 |
| 0.9006944444444445 | 0 |
| 0.9013888888888889 | 0 |
| 0.9020833333333332 | 0 |
| 0.9027777777777778 | 0 |
| 0.9034722222222222 | 0 |
| 0.9041666666666667 | 0 |
| 0.904861111111111 | 0 |
| 0.9055555555555556 | 0 |
| 0.90625 | 0 |
| 0.9069444444444444 | 0 |
| 0.907638888888889 | 0 |
| 0.9083333333333333 | 0 |
| 0.9090277777777778 | 0 |
| 0.9097222222222222 | 0 |
| 0.9104166666666668 | 0 |
| 0.9111111111111111 | 0 |
| 0.9118055555555555 | 0 |
| 0.9125 | 0 |
| 0.9131944444444445 | 0 |
| 0.9138888888888889 | 0 |
| 0.9145833333333333 | 0 |
| 0.9152777777777777 | 0 |
| 0.9159722222222223 | 0 |
| 0.9166666666666666 | 0 |
| 0.9173611111111111 | 0 |
| 0.9180555555555556 | 0 |
| 0.9187500000000001 | 0 |
| 0.9194444444444444 | 0 |
| 0.9201388888888888 | 0 |
| 0.9208333333333334 | 0 |
| 0.9215277777777778 | 0 |
| 0.9222222222222222 | 0 |
| 0.9229166666666666 | 0 |
| 0.9236111111111112 | 0 |
| 0.9243055555555556 | 0 |
| 0.9249999999999999 | 0 |
| 0.9256944444444444 | 0 |
| 0.9263888888888889 | 0 |
| 0.9270833333333334 | 0 |
| 0.9277777777777777 | 0 |
| 0.9284722222222223 | 0 |
| 0.9291666666666667 | 0 |
| 0.9298611111111111 | 0 |
| 0.9305555555555555 | 0 |
| 0.93125 | 0 |
| 0.9319444444444445 | 0 |
| 0.9326388888888889 | 0 |
| 0.9333333333333332 | 0 |
| 0.9340277777777778 | 0 |
| 0.9347222222222222 | 0 |
| 0.9354166666666667 | 0 |
| 0.936111111111111 | 0 |
| 0.9368055555555556 | 0 |
| 0.9375 | 0 |
| 0.9381944444444444 | 0 |
| 0.938888888888889 | 0 |
| 0.9395833333333333 | 0 |
| 0.9402777777777778 | 0 |
| 0.9409722222222222 | 0 |
| 0.9416666666666668 | 0 |
| 0.9423611111111111 | 0 |
| 0.9430555555555555 | 0 |
| 0.94375 | 0 |
| 0.9444444444444445 | 0 |
| 0.9451388888888889 | 0 |
| 0.9458333333333333 | 0 |
| 0.9465277777777777 | 0 |
| 0.9472222222222223 | 0 |
| 0.9479166666666666 | 0 |
| 0.9486111111111111 | 0 |
| 0.9493055555555556 | 0 |
| 0.9500000000000001 | 0 |
| 0.9506944444444444 | 0 |
| 0.9513888888888888 | 0 |
| 0.9520833333333334 | 0 |
| 0.9527777777777778 | 0 |
| 0.9534722222222222 | 0 |
| 0.9541666666666666 | 0 |
| 0.9548611111111112 | 0 |
| 0.9555555555555556 | 0 |
| 0.9562499999999999 | 0 |
| 0.9569444444444444 | 0 |
| 0.9576388888888889 | 0 |
| 0.9583333333333334 | 0 |
| 0.9590277777777777 | 0 |
| 0.9597222222222223 | 0 |
| 0.9604166666666667 | 0 |
| 0.9611111111111111 | 0 |
| 0.9618055555555555 | 0 |
| 0.9625 | 0 |
| 0.9631944444444445 | 0 |
| 0.9638888888888889 | 0 |
| 0.9645833333333332 | 0 |
| 0.9652777777777778 | 0 |
| 0.9659722222222222 | 0 |
| 0.9666666666666667 | 0 |
| 0.967361111111111 | 0 |
| 0.9680555555555556 | 0 |
| 0.96875 | 0 |
| 0.9694444444444444 | 0 |
| 0.970138888888889 | 0 |
| 0.9708333333333333 | 0 |
| 0.9715277777777778 | 0 |
| 0.9722222222222222 | 0 |
| 0.9729166666666668 | 0 |
| 0.9736111111111111 | 0 |
| 0.9743055555555555 | 0 |
| 0.975 | 0 |
| 0.9756944444444445 | 0 |
| 0.9763888888888889 | 0 |
| 0.9770833333333333 | 0 |
| 0.9777777777777777 | 0 |
| 0.9784722222222223 | 0 |
| 0.9791666666666666 | 0 |
| 0.9798611111111111 | 0 |
| 0.9805555555555556 | 0 |
| 0.9812500000000001 | 0 |
| 0.9819444444444444 | 0 |
| 0.9826388888888888 | 0 |
| 0.9833333333333334 | 0 |
| 0.9840277777777778 | 0 |
| 0.9847222222222222 | 0 |
| 0.9854166666666666 | 0 |
| 0.9861111111111112 | 0 |
| 0.9868055555555556 | 0 |
| 0.9874999999999999 | 0 |
| 0.9881944444444444 | 0 |
| 0.9888888888888889 | 0 |
| 0.9895833333333334 | 0 |
| 0.9902777777777777 | 0 |
| 0.9909722222222223 | 0 |
| 0.9916666666666667 | 0 |
| 0.9923611111111111 | 0 |
| 0.9930555555555555 | 0 |
| 0.99375 | 0 |
| 0.9944444444444445 | 0 |
| 0.9951388888888889 | 0 |
| 0.9958333333333332 | 0 |
| 0.9965277777777778 | 0 |
| 0.9972222222222222 | 0 |
| 0.9979166666666667 | 0 |
| 0.998611111111111 | 0 |
| 0.9993055555555556 | 0 |